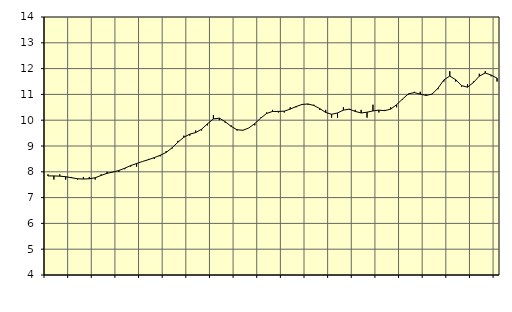
| Category | Piggar | Byggverksamhet, SNI 41-43 |
|---|---|---|
| nan | 7.9 | 7.84 |
| 1.0 | 7.7 | 7.84 |
| 1.0 | 7.9 | 7.83 |
| 1.0 | 7.7 | 7.81 |
| nan | 7.8 | 7.77 |
| 2.0 | 7.7 | 7.73 |
| 2.0 | 7.8 | 7.72 |
| 2.0 | 7.8 | 7.73 |
| nan | 7.7 | 7.77 |
| 3.0 | 7.9 | 7.86 |
| 3.0 | 8 | 7.94 |
| 3.0 | 8 | 7.99 |
| nan | 8 | 8.05 |
| 4.0 | 8.1 | 8.14 |
| 4.0 | 8.2 | 8.24 |
| 4.0 | 8.2 | 8.32 |
| nan | 8.4 | 8.4 |
| 5.0 | 8.5 | 8.47 |
| 5.0 | 8.5 | 8.55 |
| 5.0 | 8.6 | 8.64 |
| nan | 8.8 | 8.75 |
| 6.0 | 8.9 | 8.93 |
| 6.0 | 9.2 | 9.15 |
| 6.0 | 9.4 | 9.34 |
| nan | 9.4 | 9.46 |
| 7.0 | 9.6 | 9.52 |
| 7.0 | 9.6 | 9.65 |
| 7.0 | 9.8 | 9.86 |
| nan | 10.2 | 10.05 |
| 8.0 | 10 | 10.08 |
| 8.0 | 9.9 | 9.94 |
| 8.0 | 9.8 | 9.76 |
| nan | 9.6 | 9.63 |
| 9.0 | 9.6 | 9.61 |
| 9.0 | 9.7 | 9.7 |
| 9.0 | 9.8 | 9.87 |
| nan | 10.1 | 10.08 |
| 10.0 | 10.3 | 10.26 |
| 10.0 | 10.4 | 10.34 |
| 10.0 | 10.3 | 10.34 |
| nan | 10.3 | 10.35 |
| 11.0 | 10.5 | 10.43 |
| 11.0 | 10.5 | 10.53 |
| 11.0 | 10.6 | 10.61 |
| nan | 10.6 | 10.63 |
| 12.0 | 10.6 | 10.57 |
| 12.0 | 10.4 | 10.45 |
| 12.0 | 10.4 | 10.3 |
| nan | 10.1 | 10.23 |
| 13.0 | 10.1 | 10.28 |
| 13.0 | 10.5 | 10.39 |
| 13.0 | 10.4 | 10.43 |
| nan | 10.4 | 10.34 |
| 14.0 | 10.4 | 10.28 |
| 14.0 | 10.1 | 10.31 |
| 14.0 | 10.6 | 10.36 |
| nan | 10.3 | 10.39 |
| 15.0 | 10.4 | 10.37 |
| 15.0 | 10.5 | 10.43 |
| 15.0 | 10.5 | 10.6 |
| nan | 10.8 | 10.82 |
| 16.0 | 11 | 11.02 |
| 16.0 | 11.1 | 11.07 |
| 16.0 | 11.1 | 11.01 |
| nan | 11 | 10.96 |
| 17.0 | 11 | 11.01 |
| 17.0 | 11.2 | 11.24 |
| 17.0 | 11.5 | 11.56 |
| nan | 11.9 | 11.71 |
| 18.0 | 11.5 | 11.57 |
| 18.0 | 11.3 | 11.34 |
| 18.0 | 11.4 | 11.28 |
| nan | 11.5 | 11.46 |
| 19.0 | 11.8 | 11.71 |
| 19.0 | 11.9 | 11.83 |
| 19.0 | 11.7 | 11.75 |
| nan | 11.5 | 11.63 |